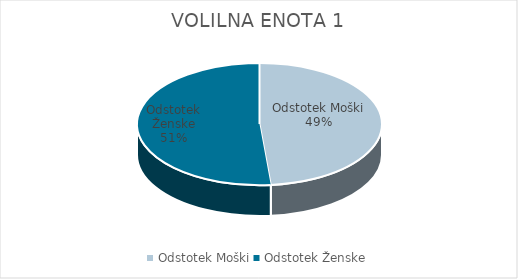
| Category | VOLILNA ENOTA 1 |
|---|---|
| Odstotek Moški | 35.43 |
| Odstotek Ženske | 37.57 |